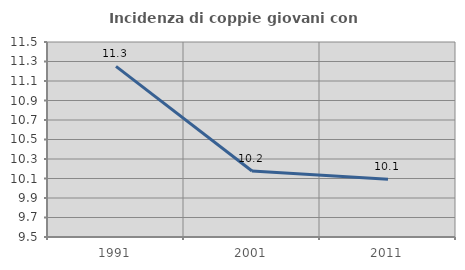
| Category | Incidenza di coppie giovani con figli |
|---|---|
| 1991.0 | 11.25 |
| 2001.0 | 10.177 |
| 2011.0 | 10.092 |